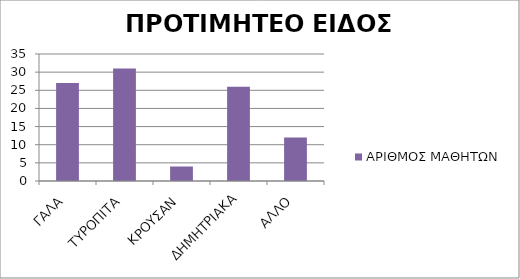
| Category | ΑΡΙΘΜΟΣ ΜΑΘΗΤΩΝ |
|---|---|
| ΓΑΛΑ | 27 |
| ΤΥΡΟΠΙΤΑ | 31 |
| ΚΡΟΥΣΑΝ | 4 |
| ΔΗΜΗΤΡΙΑΚΑ | 26 |
| ΑΛΛΟ | 12 |